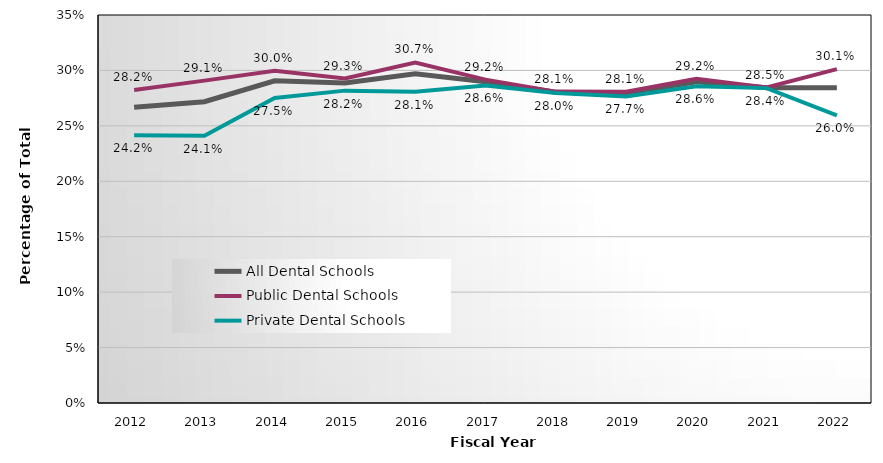
| Category | All Dental Schools | Public Dental Schools | Private Dental Schools |
|---|---|---|---|
| 2012.0 | 0.267 | 0.282 | 0.242 |
| 2013.0 | 0.272 | 0.291 | 0.241 |
| 2014.0 | 0.291 | 0.3 | 0.275 |
| 2015.0 | 0.289 | 0.293 | 0.282 |
| 2016.0 | 0.297 | 0.307 | 0.281 |
| 2017.0 | 0.29 | 0.292 | 0.286 |
| 2018.0 | 0.28 | 0.281 | 0.28 |
| 2019.0 | 0.279 | 0.281 | 0.277 |
| 2020.0 | 0.29 | 0.292 | 0.286 |
| 2021.0 | 0.284 | 0.285 | 0.284 |
| 2022.0 | 0.284 | 0.301 | 0.26 |